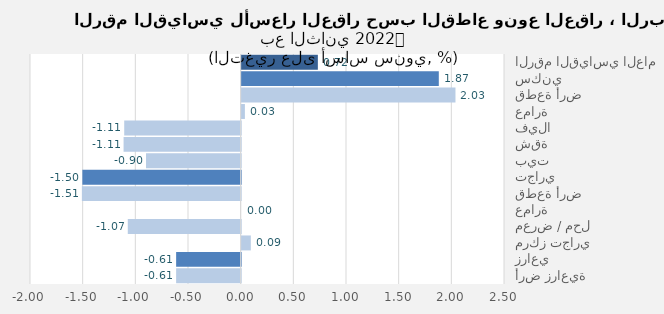
| Category | Series 0 |
|---|---|
| الرقم القياسي العام | 0.723 |
| سكني | 1.872 |
| قطعة أرض | 2.03 |
| عمارة | 0.031 |
| فيلا | -1.106 |
| شقة | -1.112 |
| بيت | -0.898 |
| تجاري | -1.503 |
| قطعة أرض | -1.507 |
| عمارة | 0 |
| معرض / محل | -1.072 |
| مركز تجاري | 0.087 |
| زراعي | -0.613 |
| أرض زراعية | -0.613 |